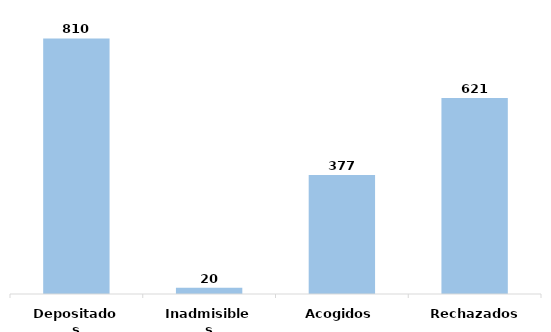
| Category | Series 0 |
|---|---|
| Depositados | 810 |
| Inadmisibles | 20 |
| Acogidos | 377 |
| Rechazados | 621 |